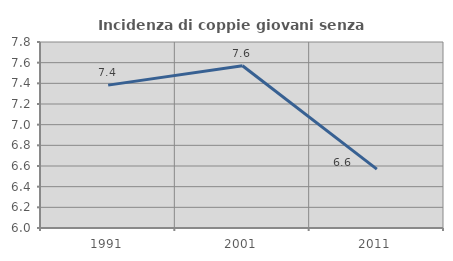
| Category | Incidenza di coppie giovani senza figli |
|---|---|
| 1991.0 | 7.383 |
| 2001.0 | 7.571 |
| 2011.0 | 6.57 |